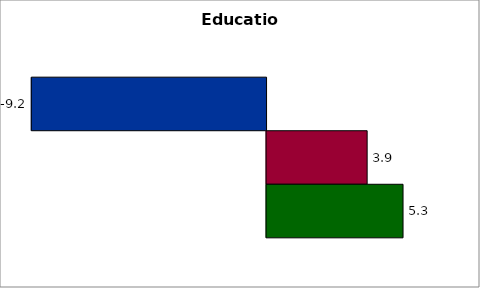
| Category | 50 states and D.C. | SREB states | State |
|---|---|---|---|
| 0 | -9.186 | 3.936 | 5.341 |